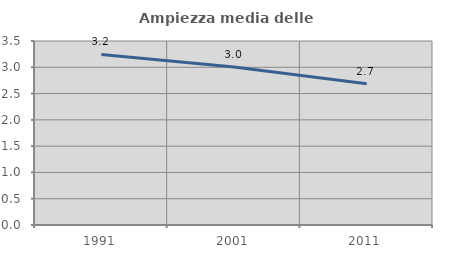
| Category | Ampiezza media delle famiglie |
|---|---|
| 1991.0 | 3.244 |
| 2001.0 | 3.006 |
| 2011.0 | 2.688 |